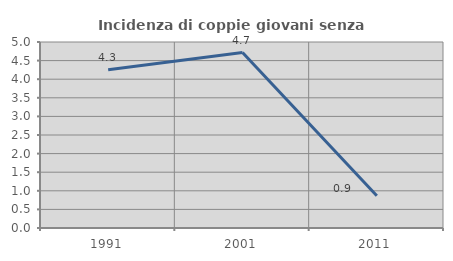
| Category | Incidenza di coppie giovani senza figli |
|---|---|
| 1991.0 | 4.255 |
| 2001.0 | 4.717 |
| 2011.0 | 0.866 |